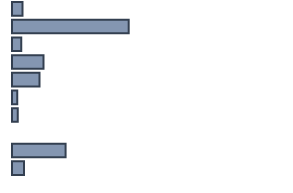
| Category | Series 0 |
|---|---|
| 0 | 3.9 |
| 1 | 42.9 |
| 2 | 3.4 |
| 3 | 11.6 |
| 4 | 10.1 |
| 5 | 1.9 |
| 6 | 2.1 |
| 7 | 0 |
| 8 | 19.7 |
| 9 | 4.4 |